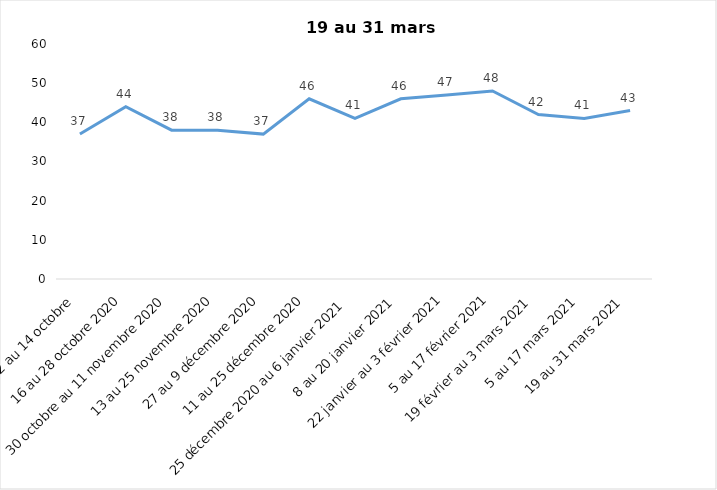
| Category | Toujours aux trois mesures |
|---|---|
| 2 au 14 octobre  | 37 |
| 16 au 28 octobre 2020 | 44 |
| 30 octobre au 11 novembre 2020 | 38 |
| 13 au 25 novembre 2020 | 38 |
| 27 au 9 décembre 2020 | 37 |
| 11 au 25 décembre 2020 | 46 |
| 25 décembre 2020 au 6 janvier 2021 | 41 |
| 8 au 20 janvier 2021 | 46 |
| 22 janvier au 3 février 2021 | 47 |
| 5 au 17 février 2021 | 48 |
| 19 février au 3 mars 2021 | 42 |
| 5 au 17 mars 2021 | 41 |
| 19 au 31 mars 2021 | 43 |